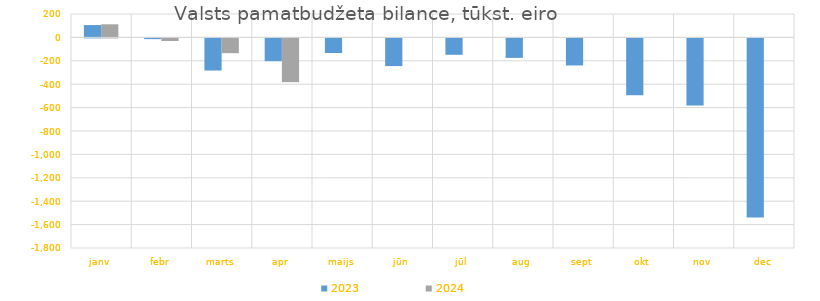
| Category | 2023 | 2024 |
|---|---|---|
| janv | 105353.718 | 111979.605 |
| febr | -6220.179 | -22271.23 |
| marts | -274666.553 | -126079.607 |
| apr | -194503.718 | -373733.707 |
| maijs | -124781.003 | 0 |
| jūn | -236599.834 | 0 |
| jūl | -140162.257 | 0 |
| aug | -166723.666 | 0 |
| sept | -231453.563 | 0 |
| okt | -484910.74 | 0 |
| nov | -572440.257 | 0 |
| dec | -1531000.702 | 0 |